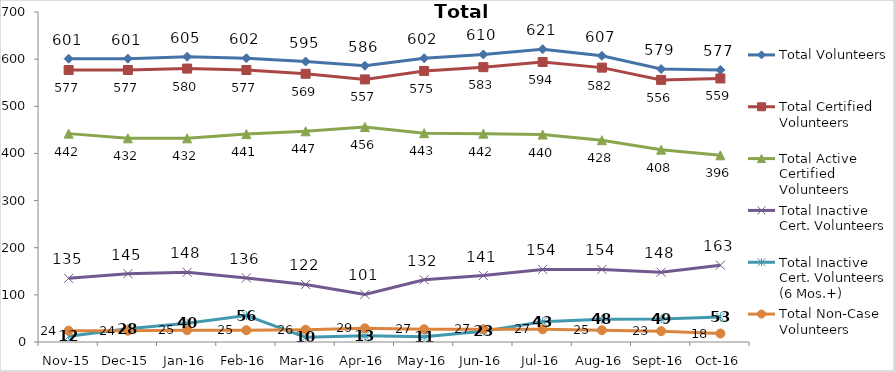
| Category | Total Volunteers | Total Certified Volunteers | Total Active Certified Volunteers | Total Inactive Cert. Volunteers | Total Inactive Cert. Volunteers (6 Mos.+) | Total Non-Case Volunteers |
|---|---|---|---|---|---|---|
| Nov-15 | 601 | 577 | 442 | 135 | 12 | 24 |
| Dec-15 | 601 | 577 | 432 | 145 | 28 | 24 |
| Jan-16 | 605 | 580 | 432 | 148 | 40 | 25 |
| Feb-16 | 602 | 577 | 441 | 136 | 56 | 25 |
| Mar-16 | 595 | 569 | 447 | 122 | 10 | 26 |
| Apr-16 | 586 | 557 | 456 | 101 | 13 | 29 |
| May-16 | 602 | 575 | 443 | 132 | 11 | 27 |
| Jun-16 | 610 | 583 | 442 | 141 | 23 | 27 |
| Jul-16 | 621 | 594 | 440 | 154 | 43 | 27 |
| Aug-16 | 607 | 582 | 428 | 154 | 48 | 25 |
| Sep-16 | 579 | 556 | 408 | 148 | 49 | 23 |
| Oct-16 | 577 | 559 | 396 | 163 | 53 | 18 |